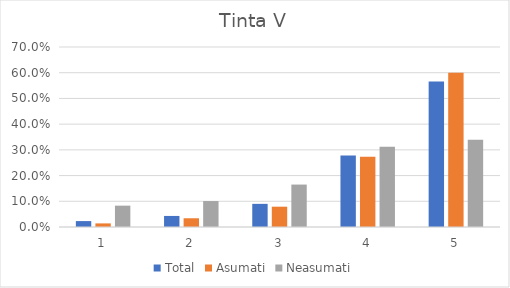
| Category | Total | Asumati | Neasumati |
|---|---|---|---|
| 0 | 0.023 | 0.014 | 0.083 |
| 1 | 0.043 | 0.034 | 0.101 |
| 2 | 0.09 | 0.079 | 0.165 |
| 3 | 0.278 | 0.273 | 0.312 |
| 4 | 0.566 | 0.6 | 0.339 |